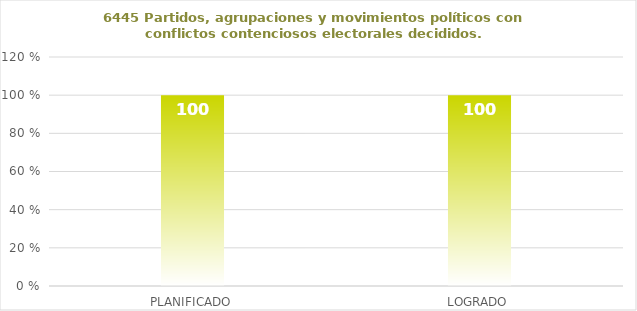
| Category | 6445 |
|---|---|
| PLANIFICADO | 100 |
| LOGRADO | 100 |